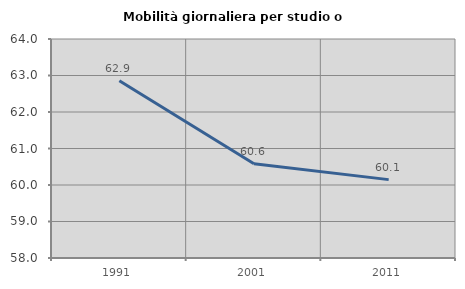
| Category | Mobilità giornaliera per studio o lavoro |
|---|---|
| 1991.0 | 62.858 |
| 2001.0 | 60.582 |
| 2011.0 | 60.147 |